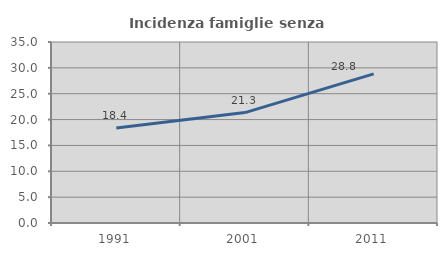
| Category | Incidenza famiglie senza nuclei |
|---|---|
| 1991.0 | 18.367 |
| 2001.0 | 21.346 |
| 2011.0 | 28.832 |